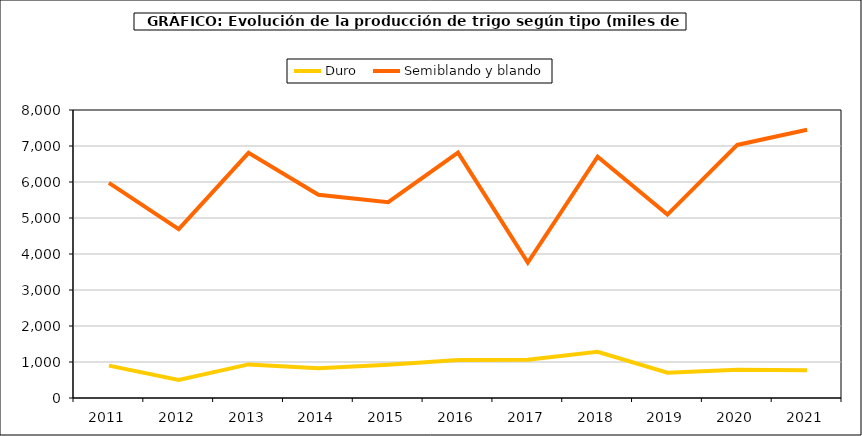
| Category | Duro | Semiblando y blando |
|---|---|---|
| 2011 | 900.352 | 5976.299 |
| 2012 | 499.493 | 4690.335 |
| 2013 | 933.268 | 6811.661 |
| 2014 | 825.433 | 5647.301 |
| 2015 | 924.956 | 5437.736 |
| 2016 | 1057.913 | 6815.222 |
| 2017 | 1061.648 | 3763.461 |
| 2018 | 1282.494 | 6703.231 |
| 2019 | 704.086 | 5094.609 |
| 2020 | 787.455 | 7029.605 |
| 2021 | 770.406 | 7449.742 |